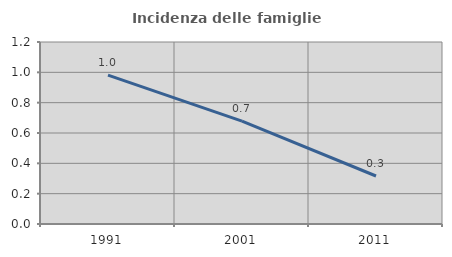
| Category | Incidenza delle famiglie numerose |
|---|---|
| 1991.0 | 0.982 |
| 2001.0 | 0.678 |
| 2011.0 | 0.316 |